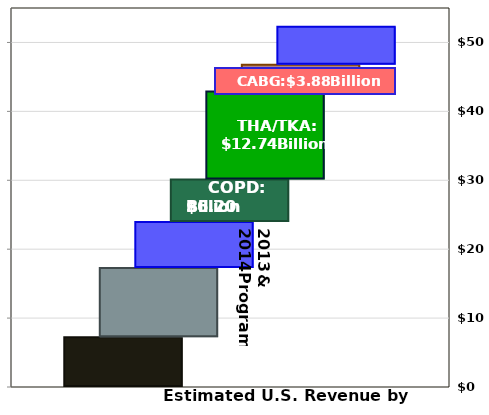
| Category | AMI: $6.92 Billion | Heart Failure: $9.37 Billion | Pneumonia: $6.64 Billion | COPD: $5.80 Billion | THA/TKA: $12.32 Billion | CABG: $3.88 Billion | PNx: $3.45 Billion |
|---|---|---|---|---|---|---|---|
| 0 | 7.233 | 10.051 | 6.644 | 6.202 | 12.745 | 3.878 | 5.544 |